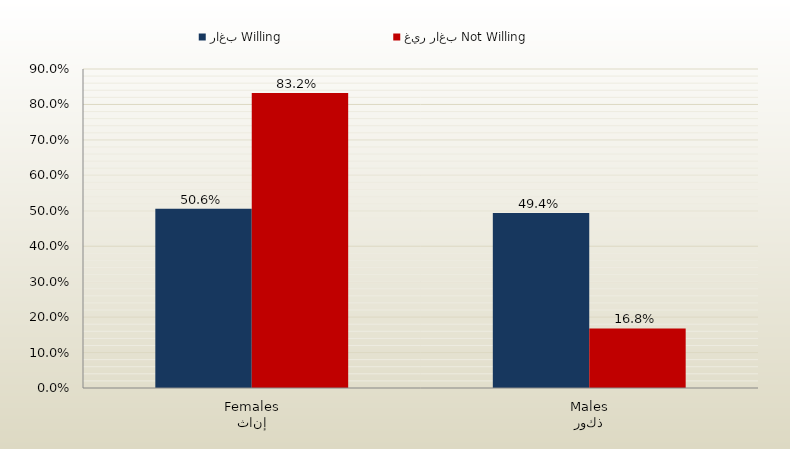
| Category | راغب Willing | غير راغب Not Willing |
|---|---|---|
| إناث
Females | 0.506 | 0.832 |
| ذكور
Males | 0.494 | 0.168 |